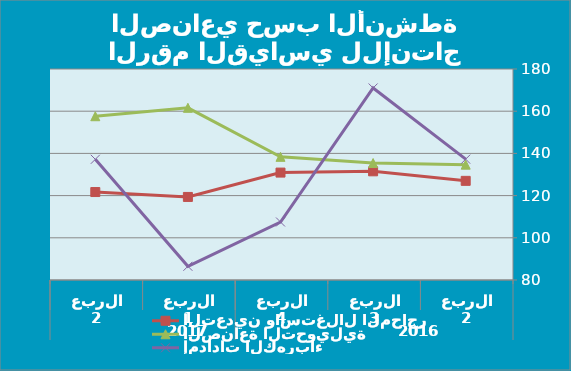
| Category | IIPالرقم القياسي العام  | التعدين واستغلال المحاجر | الصناعة التحويلية | إمدادات الكهرباء |
|---|---|---|---|---|
| 0 |  | 126.99 | 134.67 | 137.27 |
| 1 |  | 131.51 | 135.43 | 171 |
| 2 |  | 130.91 | 138.37 | 107.49 |
| 3 |  | 119.36 | 161.6 | 86.5 |
| 4 |  | 121.69 | 157.62 | 137.2 |